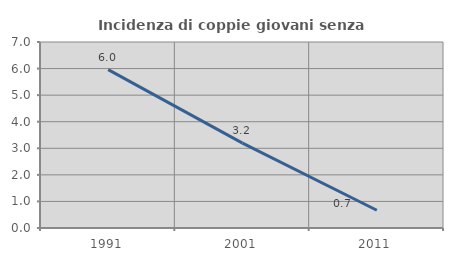
| Category | Incidenza di coppie giovani senza figli |
|---|---|
| 1991.0 | 5.96 |
| 2001.0 | 3.195 |
| 2011.0 | 0.669 |